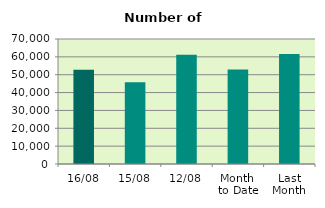
| Category | Series 0 |
|---|---|
| 16/08 | 52828 |
| 15/08 | 45802 |
| 12/08 | 61218 |
| Month 
to Date | 52895.833 |
| Last
Month | 61549.619 |